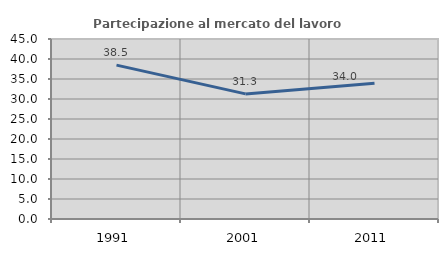
| Category | Partecipazione al mercato del lavoro  femminile |
|---|---|
| 1991.0 | 38.462 |
| 2001.0 | 31.279 |
| 2011.0 | 33.951 |